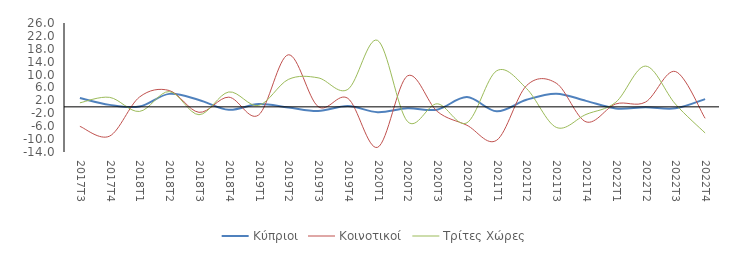
| Category | Κύπριοι | Κοινοτικοί | Τρίτες Χώρες |
|---|---|---|---|
| 2017Τ3 | 2.76 | -6.051 | 1.245 |
| 2017Τ4 | 0.611 | -9.065 | 2.94 |
| 2018Τ1 | 0.102 | 3.027 | -1.426 |
| 2018Τ2 | 4.023 | 5.079 | 4.742 |
| 2018Τ3 | 2.13 | -1.698 | -2.439 |
| 2018Τ4 | -0.92 | 3.002 | 4.61 |
| 2019Τ1 | 0.847 | -2.551 | 0.424 |
| 2019Τ2 | -0.212 | 16.147 | 8.492 |
| 2019Τ3 | -1.307 | 0.095 | 9.007 |
| 2019Τ4 | 0.246 | 2.642 | 5.414 |
| 2020Τ1 | -1.648 | -12.551 | 20.599 |
| 2020Τ2 | -0.459 | 9.585 | -4.501 |
| 2020Τ3 | -0.868 | -1.397 | 0.948 |
| 2020Τ4 | 3.026 | -5.709 | -4.94 |
| 2021Τ1 | -1.383 | -10.349 | 11.181 |
| 2021Τ2 | 2.188 | 6.564 | 5.695 |
| 2021Τ3 | 4.07 | 7.34 | -6.362 |
| 2021Τ4 | 1.853 | -4.645 | -2.354 |
| 2022Τ1 | -0.481 | 0.899 | 1.427 |
| 2022Τ2 | -0.126 | 1.492 | 12.634 |
| 2022Τ3 | -0.463 | 10.962 | 0.885 |
| 2022Τ4 | 2.39 | -3.557 | -8.097 |